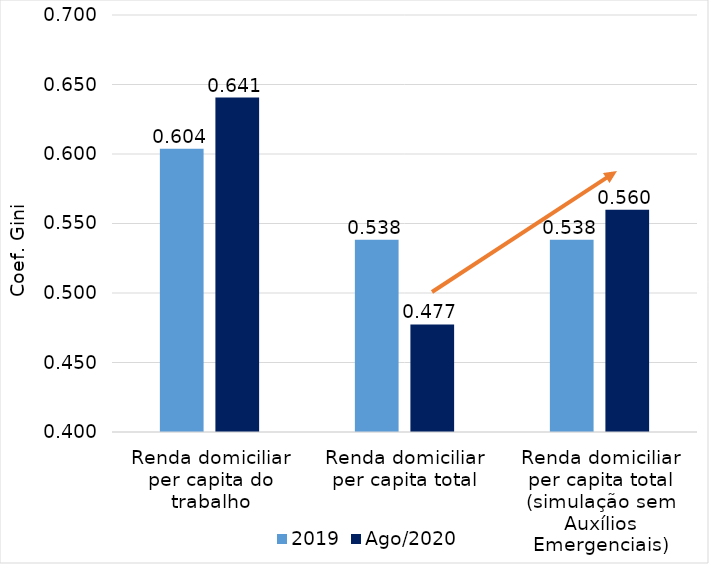
| Category | 2019 | Ago/2020 |
|---|---|---|
| Renda domiciliar per capita do trabalho | 0.604 | 0.641 |
| Renda domiciliar per capita total | 0.538 | 0.477 |
| Renda domiciliar per capita total (simulação sem Auxílios Emergenciais) | 0.538 | 0.56 |